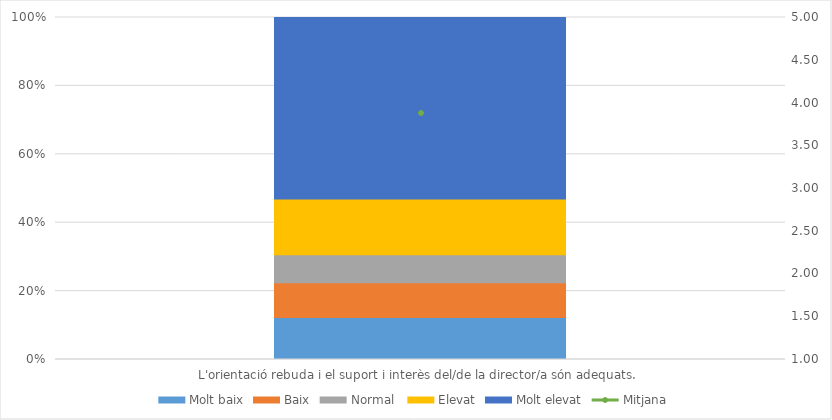
| Category | Molt baix | Baix | Normal  | Elevat | Molt elevat |
|---|---|---|---|---|---|
| L'orientació rebuda i el suport i interès del/de la director/a són adequats. | 6 | 5 | 4 | 8 | 26 |